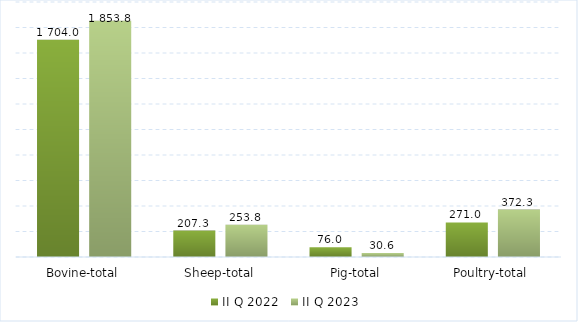
| Category | II Q 2022 | II Q 2023 |
|---|---|---|
| Bovine-total | 1704 | 1853.58 |
| Sheep-total | 207.3 | 253.8 |
| Pig-total | 75.963 | 30.6 |
| Poultry-total | 271 | 372.3 |